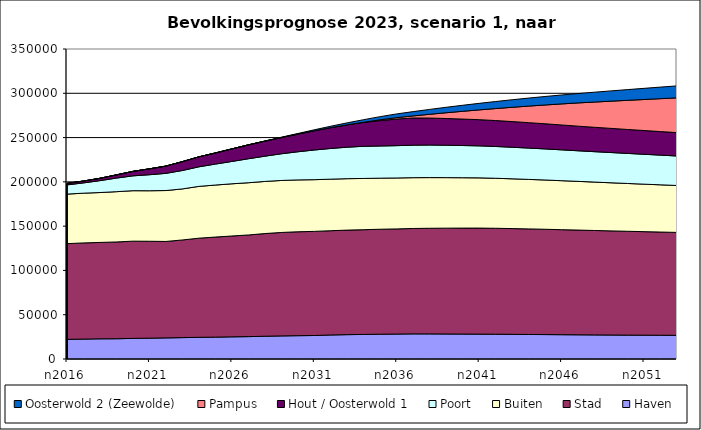
| Category | Haven | Stad | Buiten | Poort | Hout / Oosterwold 1 | Pampus | Oosterwold 2 (Zeewolde) |
|---|---|---|---|---|---|---|---|
| n2016 | 22163 | 108058 | 55963 | 10380 | 1735 | 0 | 0 |
| n2017 | 22476 | 108596 | 56136 | 11625 | 2084 | 0 | 0 |
| n2018 | 22795 | 108811 | 56339 | 13431 | 2652 | 0 | 0 |
| n2019 | 22863 | 109274 | 56769 | 15350 | 3639 | 0 | 0 |
| n2020 | 23263 | 109776 | 56980 | 16767 | 5055 | 0 | 0 |
| n2021 | 23531 | 109402 | 57019 | 18097 | 6659 | 0 | 0 |
| n2022 | 23825 | 108881 | 57500 | 19386 | 8207 | 0 | 0 |
| n2023 | 24139 | 110270 | 57621 | 20778 | 10033 | 0 | 0 |
| n2024 | 24481 | 111932 | 58478 | 22086 | 11271 | 0 | 0 |
| n2025 | 24680 | 113008 | 58712 | 23668 | 12556 | 0 | 0 |
| n2026 | 25016 | 113860 | 58925 | 25232 | 14204 | 0 | 0 |
| n2027 | 25268 | 114758 | 58970 | 27079 | 15668 | 0 | 0 |
| n2028 | 25697 | 115921 | 58842 | 28511 | 16968 | 0 | 177 |
| n2029 | 26072 | 116788 | 58708 | 30117 | 18288 | 0 | 429 |
| n2030 | 26333 | 117307 | 58547 | 31775 | 19950 | 0 | 683 |
| n2031 | 26532 | 117550 | 58378 | 33521 | 21714 | 0 | 1071 |
| n2032 | 27137 | 117704 | 58201 | 34661 | 23541 | 0 | 1578 |
| n2033 | 27500 | 118010 | 58073 | 35573 | 25258 | 0 | 2224 |
| n2034 | 27741 | 118243 | 57873 | 36303 | 26999 | 183 | 2875 |
| n2035 | 27991 | 118501 | 57678 | 36341 | 28679 | 926 | 3529 |
| n2036 | 28176 | 118701 | 57498 | 36497 | 30065 | 1585 | 4186 |
| n2037 | 28381 | 118979 | 57362 | 36731 | 30660 | 2357 | 4839 |
| n2038 | 28336 | 119280 | 57186 | 36793 | 30434 | 4284 | 5490 |
| n2039 | 28244 | 119482 | 57048 | 36600 | 30152 | 6523 | 6138 |
| n2040 | 28166 | 119621 | 56856 | 36377 | 29877 | 8783 | 6783 |
| n2041 | 28086 | 119725 | 56692 | 36140 | 29554 | 11064 | 7377 |
| n2042 | 27983 | 119607 | 56461 | 35889 | 29274 | 13555 | 7939 |
| n2043 | 27839 | 119408 | 56206 | 35632 | 28972 | 16140 | 8493 |
| n2044 | 27695 | 119197 | 55890 | 35367 | 28682 | 18709 | 9041 |
| n2045 | 27581 | 118903 | 55621 | 35089 | 28367 | 21242 | 9569 |
| n2046 | 27445 | 118563 | 55300 | 34847 | 28069 | 23769 | 10093 |
| n2047 | 27315 | 118253 | 54978 | 34544 | 27790 | 26242 | 10600 |
| n2048 | 27192 | 117911 | 54637 | 34327 | 27529 | 28523 | 11107 |
| n2049 | 27080 | 117563 | 54301 | 34159 | 27264 | 30737 | 11597 |
| n2050 | 26969 | 117229 | 53975 | 33945 | 27024 | 32911 | 12095 |
| n2051 | 26900 | 116881 | 53623 | 33735 | 26802 | 35056 | 12571 |
| n2052 | 26815 | 116530 | 53302 | 33519 | 26587 | 37167 | 13055 |
| n2053 | 26725 | 116186 | 52984 | 33301 | 26390 | 39234 | 13531 |